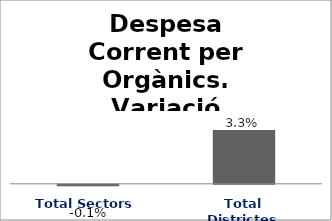
| Category | Series 0 |
|---|---|
| Total Sectors | -0.001 |
| Total Districtes | 0.033 |